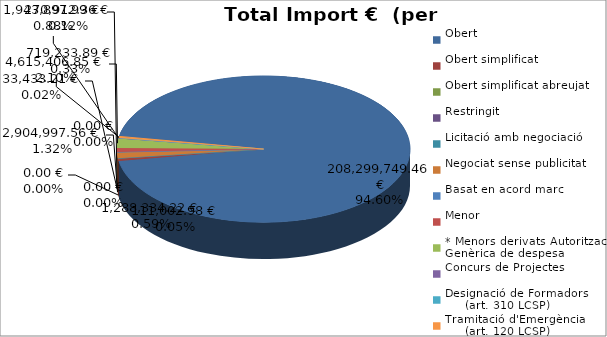
| Category | Total preu
(amb IVA) |
|---|---|
| Obert | 208299749.458 |
| Obert simplificat | 1288334.216 |
| Obert simplificat abreujat | 111002.98 |
| Restringit | 0 |
| Licitació amb negociació | 0 |
| Negociat sense publicitat | 2904997.56 |
| Basat en acord marc | 33433.21 |
| Menor | 1943897.989 |
| * Menors derivats Autorització Genèrica de despesa | 4615406.85 |
| Concurs de Projectes | 270912.36 |
| Designació de Formadors
     (art. 310 LCSP) | 0 |
| Tramitació d'Emergència
     (art. 120 LCSP) | 719233.886 |